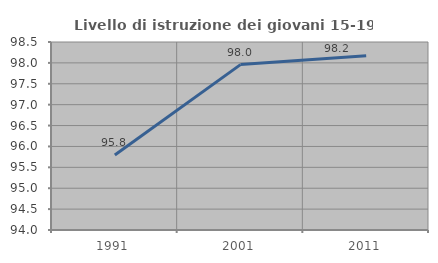
| Category | Livello di istruzione dei giovani 15-19 anni |
|---|---|
| 1991.0 | 95.794 |
| 2001.0 | 97.959 |
| 2011.0 | 98.174 |